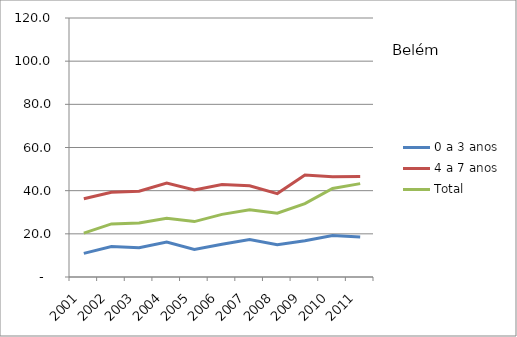
| Category | 0 a 3 anos | 4 a 7 anos | Total |
|---|---|---|---|
| 2001.0 | 10.95 | 36.26 | 20.34 |
| 2002.0 | 14.15 | 39.25 | 24.6 |
| 2003.0 | 13.55 | 39.72 | 25.05 |
| 2004.0 | 16.23 | 43.52 | 27.2 |
| 2005.0 | 12.8 | 40.34 | 25.67 |
| 2006.0 | 15.14 | 42.88 | 29.02 |
| 2007.0 | 17.38 | 42.27 | 31.19 |
| 2008.0 | 14.93 | 38.65 | 29.52 |
| 2009.0 | 16.78 | 47.27 | 34.02 |
| 2010.0 | 19.22 | 46.47 | 41.04 |
| 2011.0 | 18.55 | 46.51 | 43.27 |